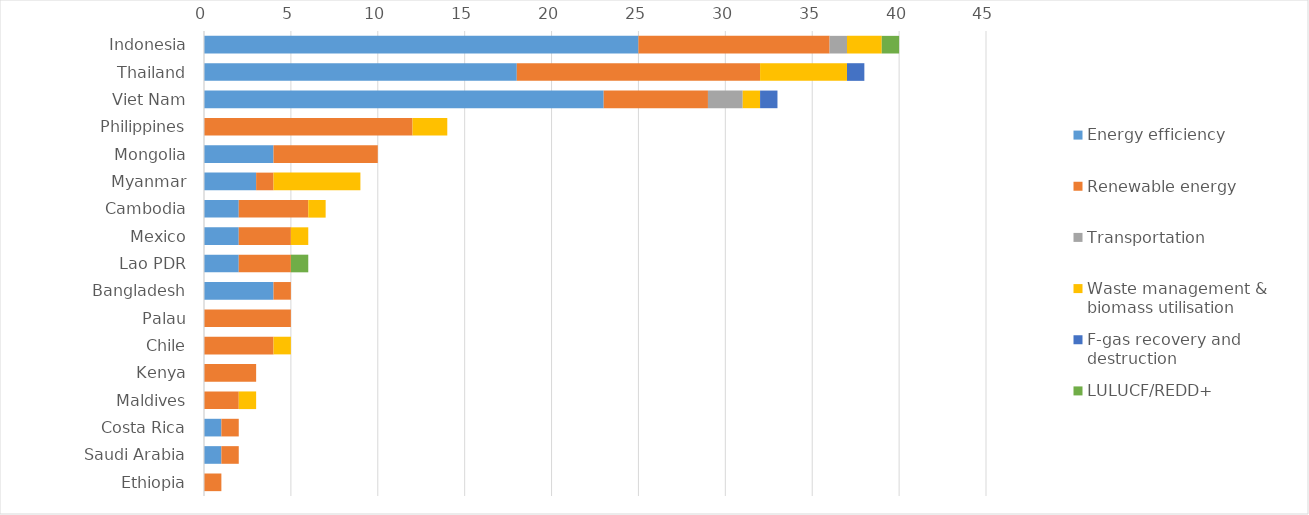
| Category | Energy efficiency | Renewable energy | Transportation | Waste management & biomass utilisation | F-gas recovery and destruction | LULUCF/REDD+ |
|---|---|---|---|---|---|---|
| Indonesia | 25 | 11 | 1 | 2 | 0 | 1 |
| Thailand | 18 | 14 | 0 | 5 | 1 | 0 |
| Viet Nam | 23 | 6 | 2 | 1 | 1 | 0 |
| Philippines | 0 | 12 | 0 | 2 | 0 | 0 |
| Mongolia | 4 | 6 | 0 | 0 | 0 | 0 |
| Myanmar | 3 | 1 | 0 | 5 | 0 | 0 |
| Cambodia | 2 | 4 | 0 | 1 | 0 | 0 |
| Mexico | 2 | 3 | 0 | 1 | 0 | 0 |
| Lao PDR | 2 | 3 | 0 | 0 | 0 | 1 |
| Bangladesh | 4 | 1 | 0 | 0 | 0 | 0 |
| Palau | 0 | 5 | 0 | 0 | 0 | 0 |
| Chile | 0 | 4 | 0 | 1 | 0 | 0 |
| Kenya | 0 | 3 | 0 | 0 | 0 | 0 |
| Maldives | 0 | 2 | 0 | 1 | 0 | 0 |
| Costa Rica | 1 | 1 | 0 | 0 | 0 | 0 |
| Saudi Arabia | 1 | 1 | 0 | 0 | 0 | 0 |
| Ethiopia | 0 | 1 | 0 | 0 | 0 | 0 |